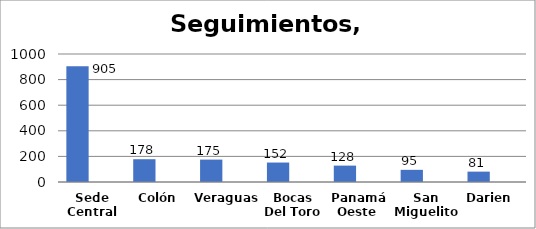
| Category | Series 0 | Series 1 |
|---|---|---|
| Sede Central | 905 |  |
| Colón | 178 |  |
| Veraguas  | 175 |  |
| Bocas Del Toro | 152 |  |
| Panamá Oeste  | 128 |  |
| San Miguelito | 95 |  |
| Darien  | 81 |  |